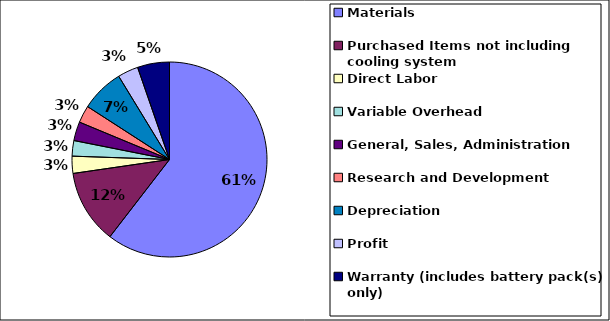
| Category | Series 0 |
|---|---|
| Materials | 4126.25 |
| Purchased Items not including cooling system | 835.929 |
| Direct Labor                      | 194.032 |
| Variable Overhead   | 175.307 |
| General, Sales, Administration | 214.453 |
| Research and Development | 195.389 |
| Depreciation | 488.471 |
| Profit      | 233.198 |
| Warranty (includes battery pack(s) only) | 361.93 |